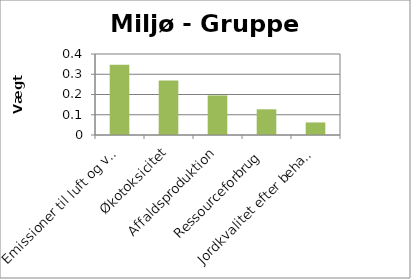
| Category | Vægt 2 |
|---|---|
| Emissioner til luft og vand | 0.347 |
| Økotoksicitet | 0.269 |
| Affaldsproduktion | 0.196 |
| Ressourceforbrug | 0.127 |
| Jordkvalitet efter behandling | 0.062 |